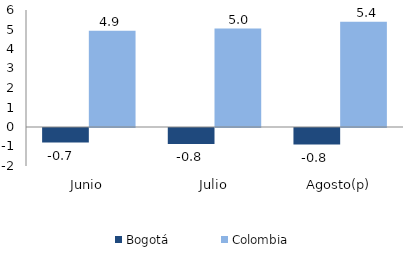
| Category | Bogotá | Colombia |
|---|---|---|
| Junio | -0.745 | 4.934 |
| Julio | -0.816 | 5.046 |
| Agosto(p) | -0.849 | 5.394 |